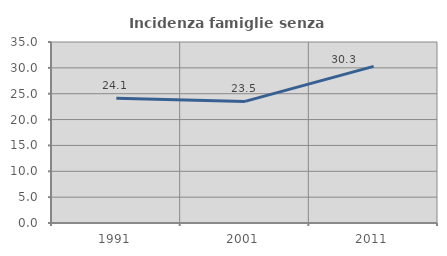
| Category | Incidenza famiglie senza nuclei |
|---|---|
| 1991.0 | 24.121 |
| 2001.0 | 23.512 |
| 2011.0 | 30.282 |